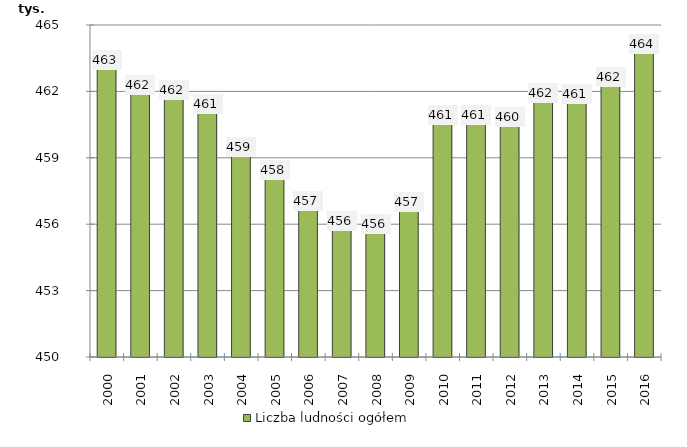
| Category | Liczba ludności ogółem |
|---|---|
| 2000.0 | 462995 |
| 2001.0 | 461885 |
| 2002.0 | 461653 |
| 2003.0 | 461011 |
| 2004.0 | 459072 |
| 2005.0 | 458053 |
| 2006.0 | 456658 |
| 2007.0 | 455717 |
| 2008.0 | 455581 |
| 2009.0 | 456591 |
| 2010.0 | 460509 |
| 2011.0 | 460517 |
| 2012.0 | 460427 |
| 2013.0 | 461531 |
| 2014.0 | 461489 |
| 2015.0 | 462249 |
| 2016.0 | 463754 |